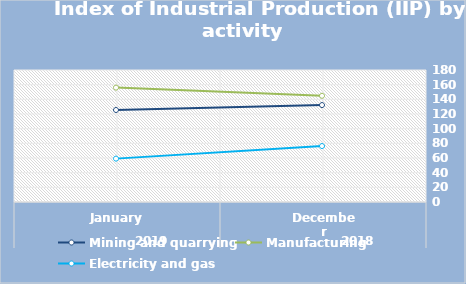
| Category | Mining and quarrying   | Manufacturing | Electricity and gas |
|---|---|---|---|
| 0 | 132.18 | 144.85 | 76.31 |
| 1 | 125.45 | 155.98 | 59.15 |